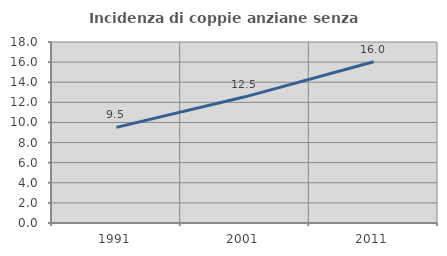
| Category | Incidenza di coppie anziane senza figli  |
|---|---|
| 1991.0 | 9.509 |
| 2001.0 | 12.547 |
| 2011.0 | 16.042 |